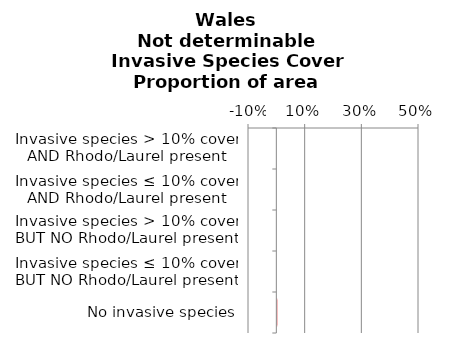
| Category | Not determinable |
|---|---|
| No invasive species | 0.002 |
| Invasive species ≤ 10% cover BUT NO Rhodo/Laurel present | 0 |
| Invasive species > 10% cover BUT NO Rhodo/Laurel present | 0 |
| Invasive species ≤ 10% cover AND Rhodo/Laurel present | 0 |
| Invasive species > 10% cover AND Rhodo/Laurel present | 0 |